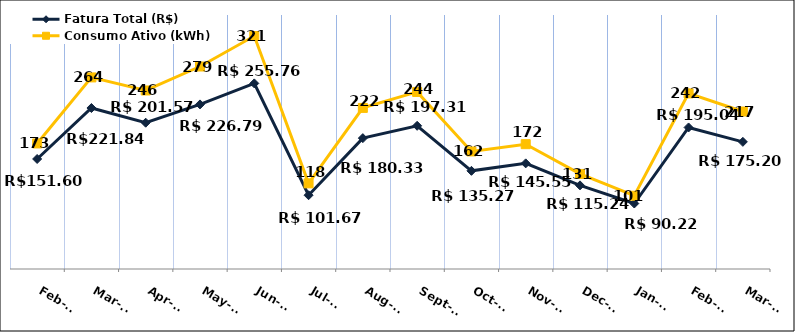
| Category | Fatura Total (R$) |
|---|---|
| 2023-02-01 | 151.6 |
| 2023-03-01 | 221.84 |
| 2023-04-01 | 201.57 |
| 2023-05-01 | 226.79 |
| 2023-06-01 | 255.76 |
| 2023-07-01 | 101.67 |
| 2023-08-01 | 180.33 |
| 2023-09-01 | 197.31 |
| 2023-10-01 | 135.27 |
| 2023-11-01 | 145.55 |
| 2023-12-01 | 115.24 |
| 2024-01-01 | 90.22 |
| 2024-02-01 | 195.04 |
| 2024-03-01 | 175.2 |